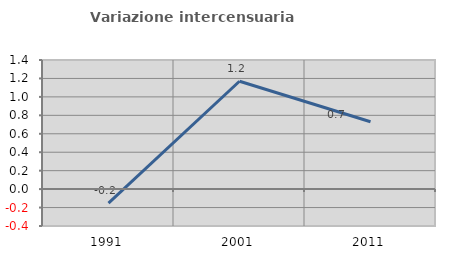
| Category | Variazione intercensuaria annua |
|---|---|
| 1991.0 | -0.152 |
| 2001.0 | 1.17 |
| 2011.0 | 0.73 |